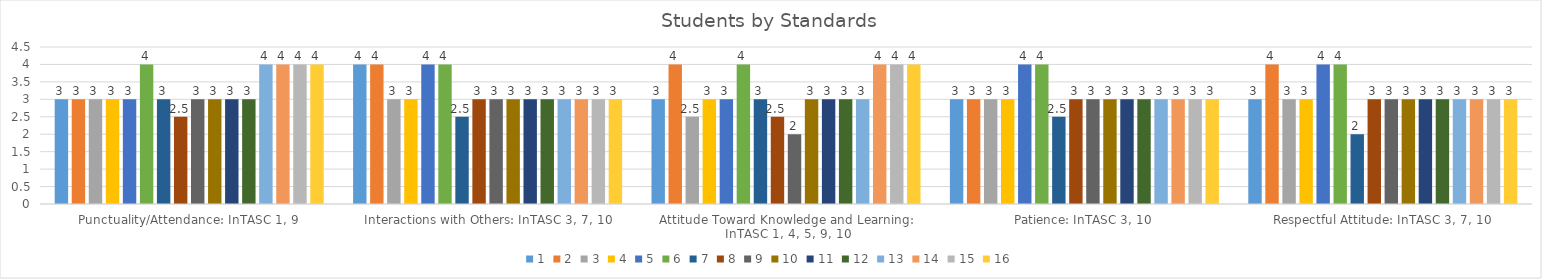
| Category | 1 | 2 | 3 | 4 | 5 | 6 | 7 | 8 | 9 | 10 | 11 | 12 | 13 | 14 | 15 | 16 |
|---|---|---|---|---|---|---|---|---|---|---|---|---|---|---|---|---|
| Punctuality/Attendance: InTASC 1, 9 | 3 | 3 | 3 | 3 | 3 | 4 | 3 | 2.5 | 3 | 3 | 3 | 3 | 4 | 4 | 4 | 4 |
| Interactions with Others: InTASC 3, 7, 10 | 4 | 4 | 3 | 3 | 4 | 4 | 2.5 | 3 | 3 | 3 | 3 | 3 | 3 | 3 | 3 | 3 |
| Attitude Toward Knowledge and Learning: InTASC 1, 4, 5, 9, 10 | 3 | 4 | 2.5 | 3 | 3 | 4 | 3 | 2.5 | 2 | 3 | 3 | 3 | 3 | 4 | 4 | 4 |
| Patience: InTASC 3, 10 | 3 | 3 | 3 | 3 | 4 | 4 | 2.5 | 3 | 3 | 3 | 3 | 3 | 3 | 3 | 3 | 3 |
| Respectful Attitude: InTASC 3, 7, 10 | 3 | 4 | 3 | 3 | 4 | 4 | 2 | 3 | 3 | 3 | 3 | 3 | 3 | 3 | 3 | 3 |